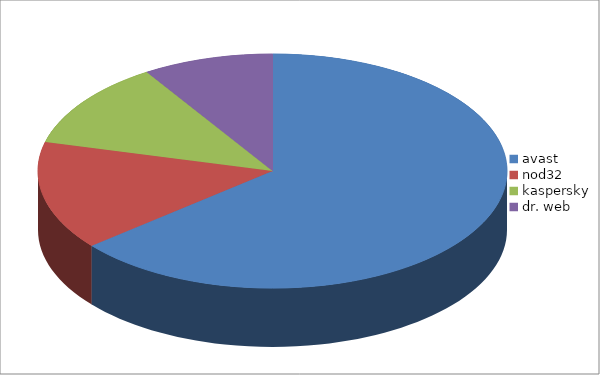
| Category | Series 0 |
|---|---|
| avast | 64 |
| nod32 | 15 |
| kaspersky | 12 |
| dr. web | 9 |